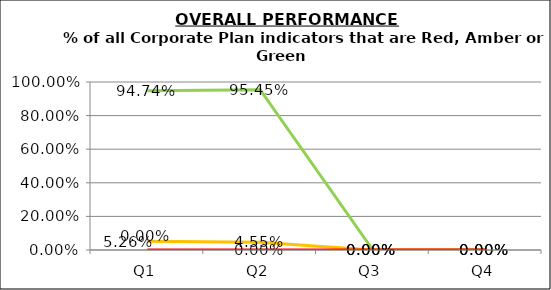
| Category | Green | Amber | Red |
|---|---|---|---|
| Q1 | 0.947 | 0.053 | 0 |
| Q2 | 0.955 | 0.045 | 0 |
| Q3 | 0 | 0 | 0 |
| Q4 | 0 | 0 | 0 |